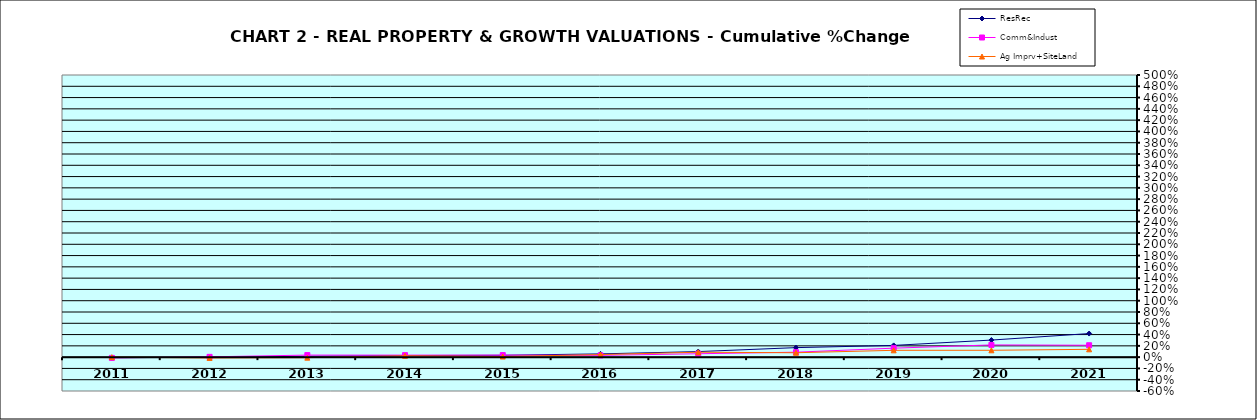
| Category | ResRec | Comm&Indust | Ag Imprv+SiteLand |
|---|---|---|---|
| 2011.0 | -0.01 | -0.013 | 0 |
| 2012.0 | -0.004 | 0.005 | -0.014 |
| 2013.0 | 0.016 | 0.036 | -0.009 |
| 2014.0 | 0.028 | 0.036 | 0.024 |
| 2015.0 | 0.034 | 0.036 | 0.011 |
| 2016.0 | 0.058 | 0.031 | 0.046 |
| 2017.0 | 0.098 | 0.06 | 0.087 |
| 2018.0 | 0.168 | 0.088 | 0.078 |
| 2019.0 | 0.208 | 0.159 | 0.121 |
| 2020.0 | 0.303 | 0.217 | 0.122 |
| 2021.0 | 0.418 | 0.211 | 0.138 |